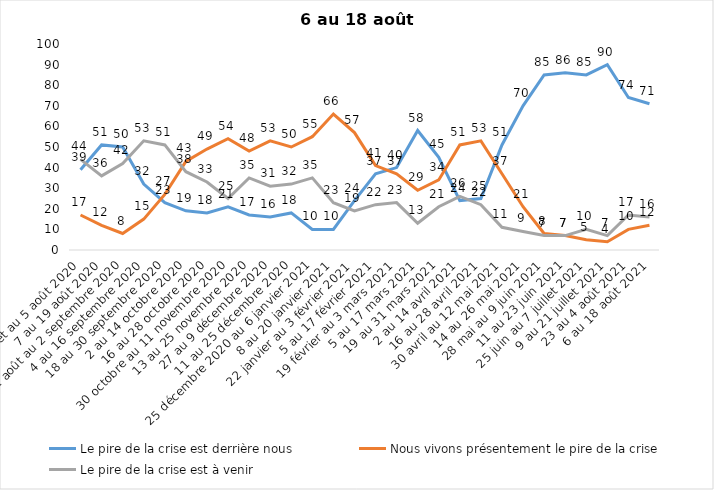
| Category | Le pire de la crise est derrière nous | Nous vivons présentement le pire de la crise | Le pire de la crise est à venir |
|---|---|---|---|
| 24 juillet au 5 août 2020 | 39 | 17 | 44 |
| 7 au 19 août 2020 | 51 | 12 | 36 |
| 21 août au 2 septembre 2020 | 50 | 8 | 42 |
| 4 au 16 septembre 2020 | 32 | 15 | 53 |
| 18 au 30 septembre 2020 | 23 | 27 | 51 |
| 2 au 14 octobre 2020 | 19 | 43 | 38 |
| 16 au 28 octobre 2020 | 18 | 49 | 33 |
| 30 octobre au 11 novembre 2020 | 21 | 54 | 25 |
| 13 au 25 novembre 2020 | 17 | 48 | 35 |
| 27 au 9 décembre 2020 | 16 | 53 | 31 |
| 11 au 25 décembre 2020 | 18 | 50 | 32 |
| 25 décembre 2020 au 6 janvier 2021 | 10 | 55 | 35 |
| 8 au 20 janvier 2021 | 10 | 66 | 23 |
| 22 janvier au 3 février 2021 | 24 | 57 | 19 |
| 5 au 17 février 2021 | 37 | 41 | 22 |
| 19 février au 3 mars 2021 | 40 | 37 | 23 |
| 5 au 17 mars 2021 | 58 | 29 | 13 |
| 19 au 31 mars 2021 | 45 | 34 | 21 |
| 2 au 14 avril 2021 | 24 | 51 | 26 |
| 16 au 28 avril 2021 | 25 | 53 | 22 |
| 30 avril au 12 mai 2021 | 51 | 37 | 11 |
| 14 au 26 mai 2021 | 70 | 21 | 9 |
| 28 mai au 9 juin 2021 | 85 | 8 | 7 |
| 11 au 23 juin 2021 | 86 | 7 | 7 |
| 25 juin au 7 juillet 2021 | 85 | 5 | 10 |
| 9 au 21 juillet 2021 | 90 | 4 | 7 |
| 23 au 4 août 2021 | 74 | 10 | 17 |
| 6 au 18 août 2021 | 71 | 12 | 16 |